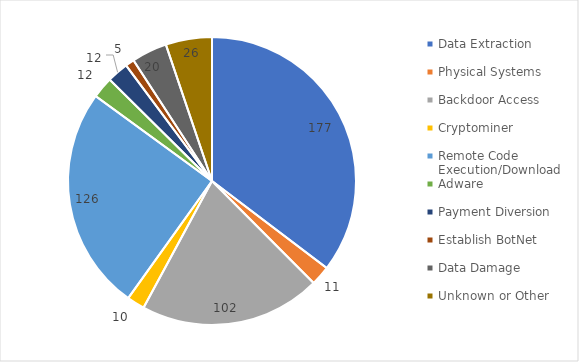
| Category | Series 0 |
|---|---|
| Data Extraction | 177 |
| Physical Systems | 11 |
| Backdoor Access | 102 |
| Cryptominer | 10 |
| Remote Code Execution/Download | 126 |
| Adware | 12 |
| Payment Diversion | 12 |
| Establish BotNet | 5 |
| Data Damage | 20 |
| Unknown or Other | 26 |